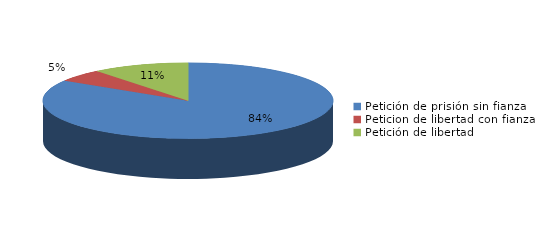
| Category | Series 0 |
|---|---|
| Petición de prisión sin fianza | 78 |
| Peticion de libertad con fianza | 5 |
| Petición de libertad | 10 |